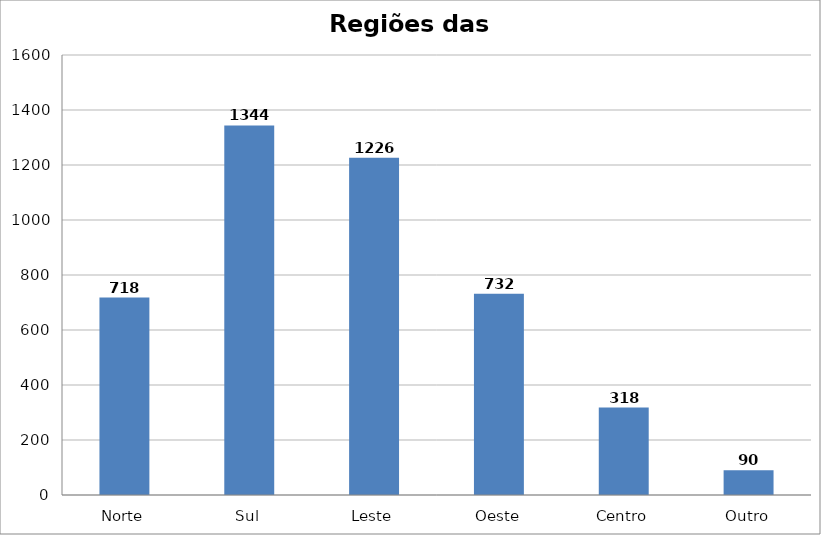
| Category | Series 0 |
|---|---|
| Norte | 718 |
| Sul | 1344 |
| Leste | 1226 |
| Oeste | 732 |
| Centro | 318 |
| Outro | 90 |